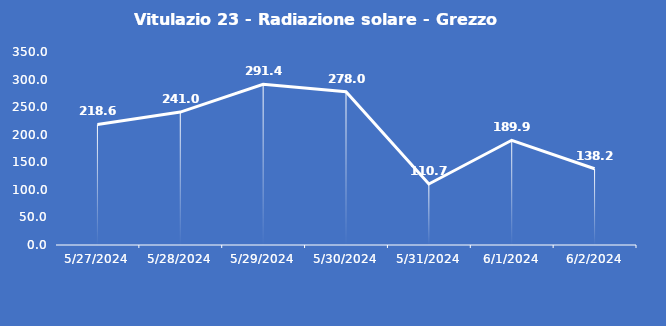
| Category | Vitulazio 23 - Radiazione solare - Grezzo (W/m2) |
|---|---|
| 5/27/24 | 218.6 |
| 5/28/24 | 241 |
| 5/29/24 | 291.4 |
| 5/30/24 | 278 |
| 5/31/24 | 110.7 |
| 6/1/24 | 189.9 |
| 6/2/24 | 138.2 |